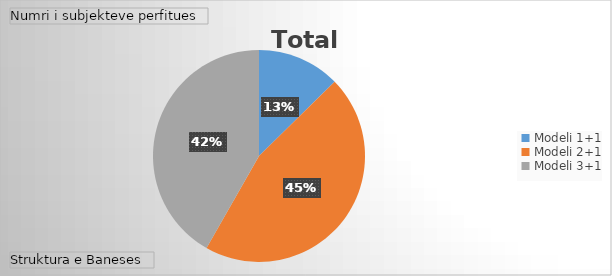
| Category | Total |
|---|---|
| Modeli 1+1 | 23 |
| Modeli 2+1 | 83 |
| Modeli 3+1 | 76 |